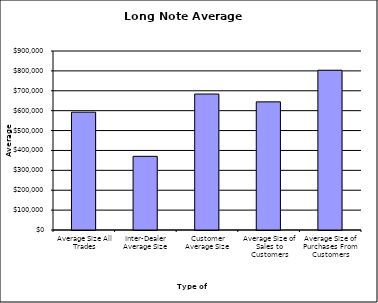
| Category | Security Type |
|---|---|
| Average Size All Trades | 592327.791 |
| Inter-Dealer Average Size | 370389.777 |
| Customer Average Size | 683571.732 |
| Average Size of Sales to Customers | 644215.794 |
| Average Size of Purchases From Customers | 803329.404 |